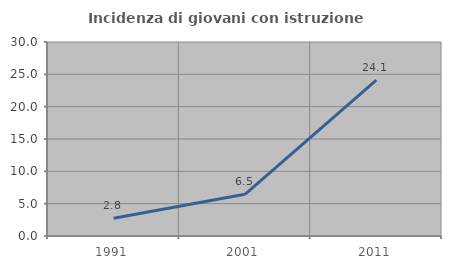
| Category | Incidenza di giovani con istruzione universitaria |
|---|---|
| 1991.0 | 2.759 |
| 2001.0 | 6.452 |
| 2011.0 | 24.121 |